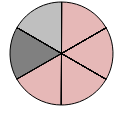
| Category | Series 1 |
|---|---|
| + + | 0 |
| + | 0 |
| o | 0 |
| - | 1 |
| - - | 0 |
| + + | 0 |
| + | 0 |
| o | 0 |
| - | 1 |
| - - | 0 |
| + + | 0 |
| + | 0 |
| o | 0 |
| - | 1 |
| - - | 0 |
| + + | 0 |
| + | 0 |
| o | 0 |
| - | 1 |
| - - | 0 |
| * * | 1 |
| * | 0 |
| o | 0 |
| * * | 0 |
| * | 1 |
| o | 0 |